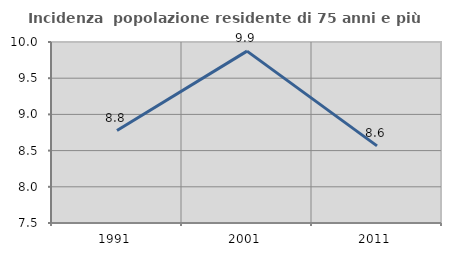
| Category | Incidenza  popolazione residente di 75 anni e più |
|---|---|
| 1991.0 | 8.777 |
| 2001.0 | 9.874 |
| 2011.0 | 8.566 |